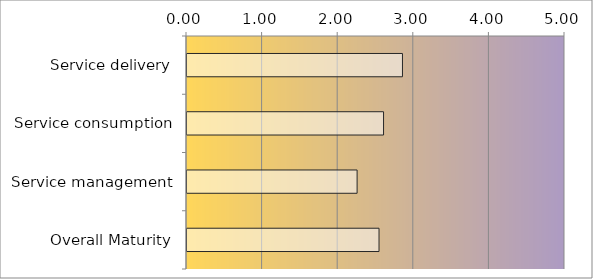
| Category | Series 0 |
|---|---|
| Service delivery | 2.85 |
| Service consumption | 2.6 |
| Service management | 2.25 |
| Overall Maturity | 2.54 |